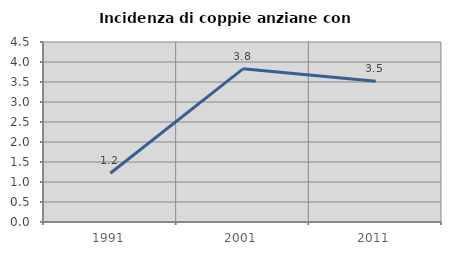
| Category | Incidenza di coppie anziane con figli |
|---|---|
| 1991.0 | 1.22 |
| 2001.0 | 3.83 |
| 2011.0 | 3.52 |